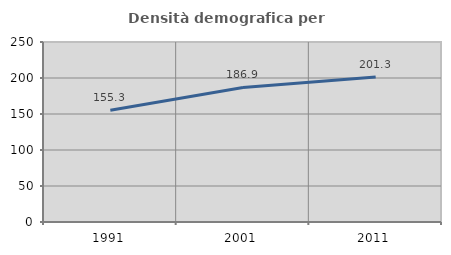
| Category | Densità demografica |
|---|---|
| 1991.0 | 155.34 |
| 2001.0 | 186.878 |
| 2011.0 | 201.264 |